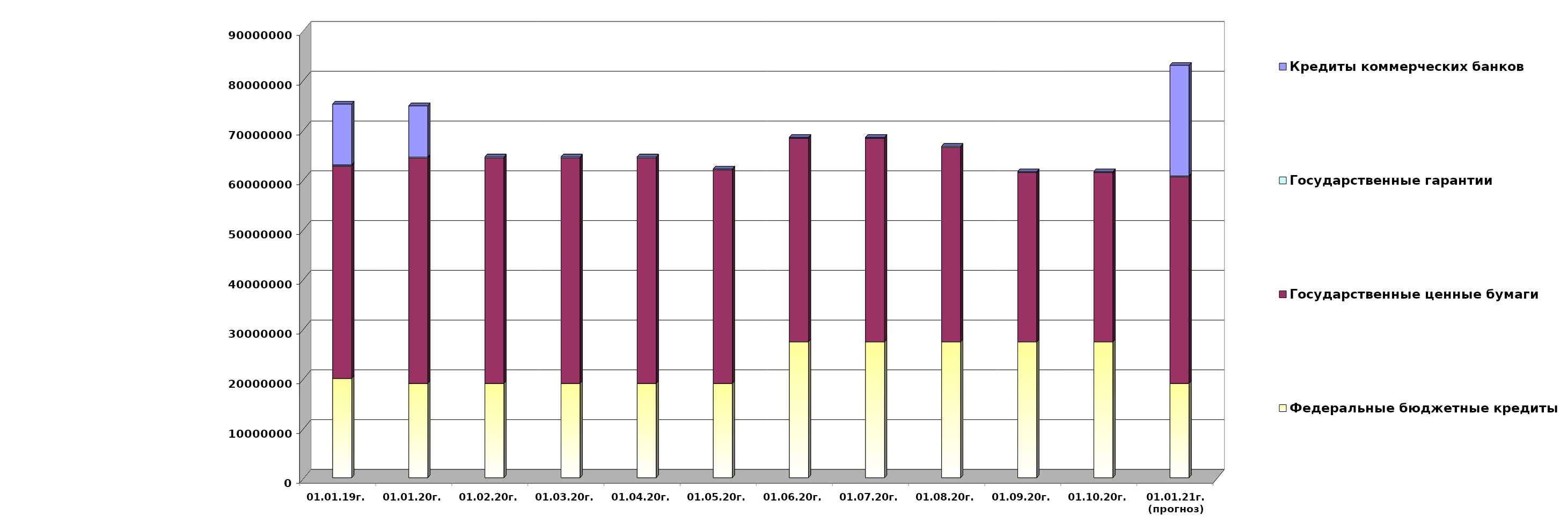
| Category | Федеральные бюджетные кредиты | Государственные ценные бумаги  | Государственные гарантии | Кредиты коммерческих банков |
|---|---|---|---|---|
| 01.01.19г. | 19957026.213 | 42700000 | 209872.86 | 12219963.75 |
| 01.01.20г. | 18954967.463 | 45300000 | 186330.02 | 10291177 |
| 01.02.20г. | 18954967.463 | 45300000 | 184738.25 | 0 |
| 01.03.20г. | 18954967.463 | 45300000 | 184738.25 | 0 |
| 01.04.20г. | 18954967.463 | 45300000 | 184738.25 | 0 |
| 01.05.20г. | 18954967.463 | 42900000 | 184738.25 | 0 |
| 01.06.20г. | 27303300.463 | 40900000 | 184738.25 | 0 |
| 01.07.20г. | 27303300.463 | 40900000 | 184738.25 | 0 |
| 01.08.20г. | 27303300.463 | 39100000 | 184738.25 | 0 |
| 01.09.20г. | 27303300.463 | 34000000 | 184738.25 | 0 |
| 01.10.20г. | 27303300.463 | 34000000 | 184738.25 | 0 |
| 01.01.21г.
(прогноз) | 18954967.5 | 41500000 | 184738.2 | 22225858.3 |